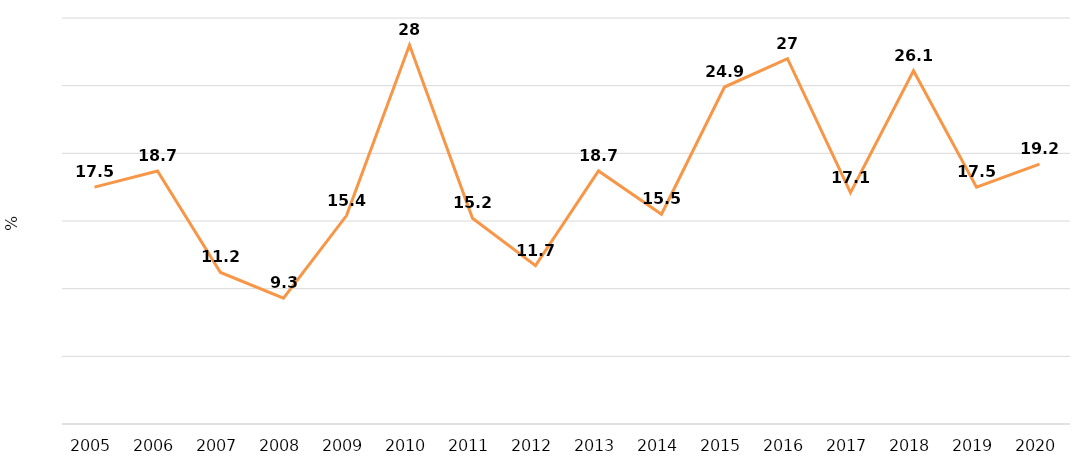
| Category | Series 0 |
|---|---|
| 2005 | 17.5 |
| 2006 | 18.7 |
| 2007 | 11.2 |
| 2008 | 9.3 |
| 2009 | 15.4 |
| 2010 | 28 |
| 2011 | 15.2 |
| 2012 | 11.7 |
| 2013 | 18.7 |
| 2014 | 15.5 |
| 2015 | 24.9 |
| 2016 | 27 |
| 2017 | 17.1 |
| 2018 | 26.1 |
| 2019 | 17.5 |
| 2020 | 19.2 |